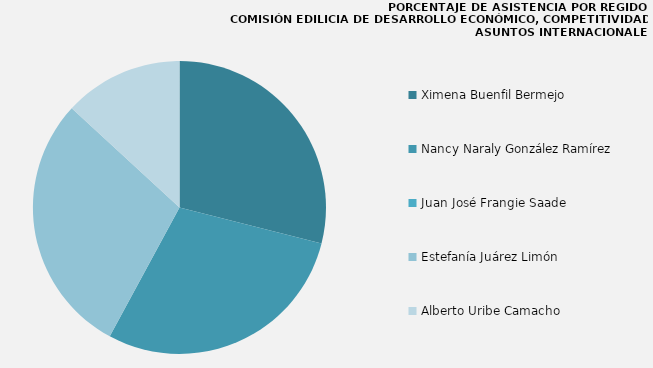
| Category | Series 0 |
|---|---|
| Ximena Buenfil Bermejo | 100 |
| Nancy Naraly González Ramírez | 100 |
| Juan José Frangie Saade | 0 |
| Estefanía Juárez Limón | 100 |
| Alberto Uribe Camacho | 45.455 |